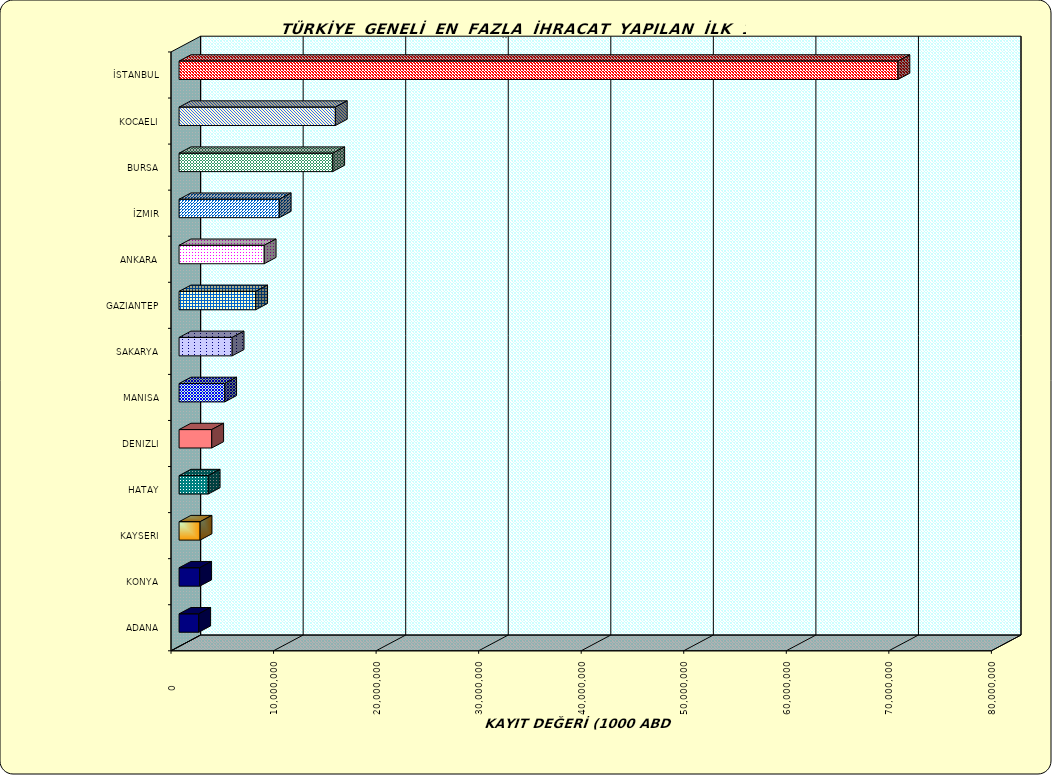
| Category | Series 0 |
|---|---|
| İSTANBUL | 70101910.999 |
| KOCAELI | 15240492.512 |
| BURSA | 14987145.949 |
| İZMIR | 9770277.894 |
| ANKARA | 8303473.682 |
| GAZIANTEP | 7471843.294 |
| SAKARYA | 5177175.703 |
| MANISA | 4450434.142 |
| DENIZLI | 3185780.209 |
| HATAY | 2841677.951 |
| KAYSERI | 2050132.885 |
| KONYA | 2013868.999 |
| ADANA | 1918852.274 |